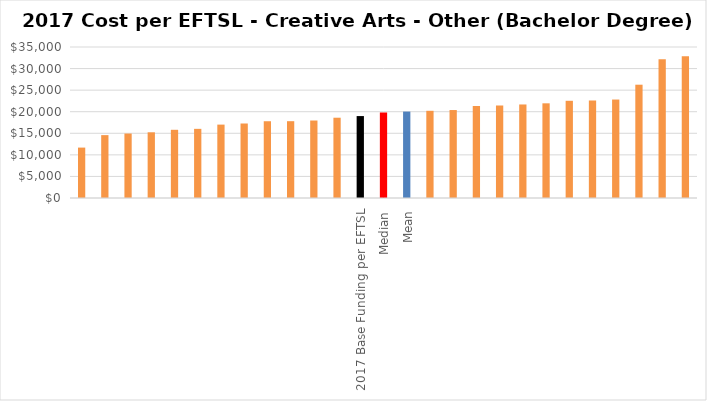
| Category | Series 0 |
|---|---|
|  | 11683.339 |
|  | 14572.907 |
|  | 14941.98 |
|  | 15230.229 |
|  | 15809.405 |
|  | 16028.35 |
|  | 17010.961 |
|  | 17268.365 |
|  | 17793.386 |
|  | 17802.426 |
|  | 17961.031 |
|  | 18609.462 |
| 2017 Base Funding per EFTSL | 18990 |
| Median | 19828.581 |
| Mean | 20033 |